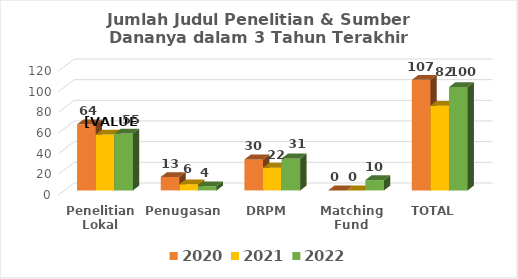
| Category | 2020 | 2021 | 2022 |
|---|---|---|---|
| 0 | 64 | 54 | 55 |
| 1 | 13 | 6 | 4 |
| 2 | 30 | 22 | 31 |
| 3 | 0 | 0 | 10 |
| 4 | 107 | 82 | 100 |